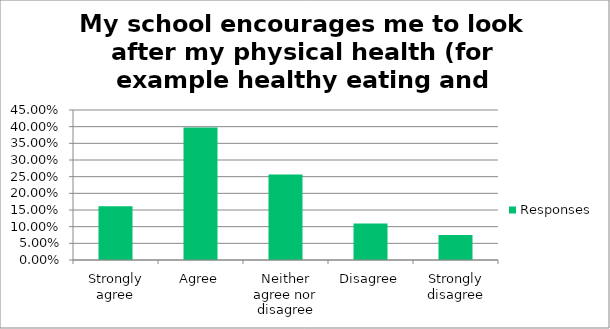
| Category | Responses |
|---|---|
| Strongly agree | 0.161 |
| Agree | 0.398 |
| Neither agree nor disagree | 0.256 |
| Disagree | 0.109 |
| Strongly disagree | 0.075 |